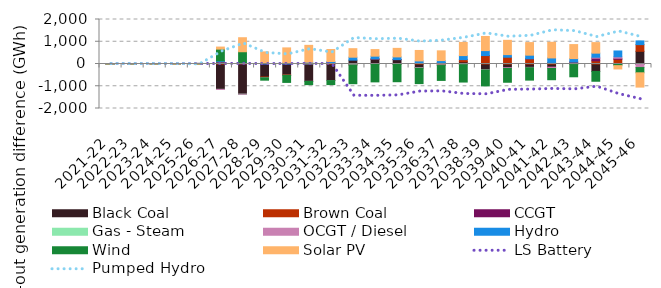
| Category | Black Coal | Brown Coal | CCGT | Gas - Steam | OCGT / Diesel | Hydro | Wind | Solar PV |
|---|---|---|---|---|---|---|---|---|
| 2021-22 | 0.016 | 0.021 | 0 | 0 | 0.001 | -0.004 | 0 | -0.695 |
| 2022-23 | 0.017 | 0.015 | 0.001 | 0 | 0.001 | -0.008 | 0.037 | -0.757 |
| 2023-24 | 0.015 | 0.022 | 0.001 | 0 | 0.001 | -0.002 | 0.018 | -3.183 |
| 2024-25 | 0.142 | 0.001 | 0.001 | 0 | 0.001 | -0.111 | 0.021 | -5.358 |
| 2025-26 | 24.784 | 0.066 | 0.001 | 0 | 0.001 | -6.015 | -0.001 | -0.756 |
| 2026-27 | -1140.457 | 95.139 | 0.001 | -0.756 | -4.346 | 45.672 | 527.357 | 92.836 |
| 2027-28 | -1357.425 | 15.461 | 0.001 | -0.164 | -0.396 | 51.231 | 484.383 | 629.655 |
| 2028-29 | -583.301 | -36.373 | 0.001 | -0.505 | -1.088 | 45.174 | -105.768 | 498.929 |
| 2029-30 | -490.898 | -20.901 | 0.001 | -1.076 | -0.063 | 55.184 | -314.37 | 668.674 |
| 2030-31 | -779.671 | 11.216 | 0.001 | 0 | -0.594 | 70.643 | -146.558 | 756.578 |
| 2031-32 | -743.722 | 52.461 | 0.001 | -0.08 | -1.247 | 60.122 | -179.39 | 540.462 |
| 2032-33 | 173.535 | -33.561 | -0.082 | -1.078 | -11.78 | 132.047 | -838.699 | 383.421 |
| 2033-34 | 209.58 | 16.139 | 0.002 | -0.087 | -0.36 | 127.356 | -802.725 | 294.633 |
| 2034-35 | 197.062 | -16.767 | 0.002 | -0.599 | -1.417 | 121.736 | -777.554 | 383.888 |
| 2035-36 | -162.768 | 36.596 | -0.104 | -2.71 | -23.961 | 101.959 | -691.739 | 469.761 |
| 2036-37 | -48.084 | 51.75 | 0.001 | -3.022 | -18.13 | 101.575 | -668.793 | 437.707 |
| 2037-38 | 97.732 | 98.634 | -0.385 | -2.629 | -26.561 | 182.097 | -781.457 | 589.429 |
| 2038-39 | -254.999 | 379.897 | 0.003 | -1.023 | -12.453 | 222.58 | -715.663 | 635.204 |
| 2039-40 | -162.542 | 305.123 | -0.068 | 0 | -34.699 | 117.112 | -623.068 | 641.512 |
| 2040-41 | -150.455 | 236.043 | 0.003 | 0 | -17.174 | 160.484 | -556.627 | 565.951 |
| 2041-42 | -144.343 | 68.715 | -0.167 | 0 | -56.41 | 203.595 | -505.328 | 702.765 |
| 2042-43 | 1.54 | 84.753 | 0.005 | 0 | -24.89 | 157.516 | -549.663 | 628.686 |
| 2043-44 | -333.837 | 142.984 | 117.944 | 0 | 42.899 | 183.988 | -441.606 | 473.727 |
| 2044-45 | -9.756 | 213.695 | 44.33 | 0 | 65.812 | 261.775 | -64.334 | -148.266 |
| 2045-46 | 570.412 | 300.544 | -18.604 | 0 | -141.097 | 166.949 | -236.363 | -641.904 |